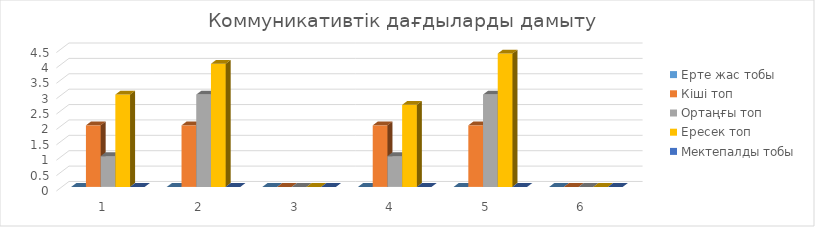
| Category | Ерте жас тобы  | Кіші топ | Ортаңғы топ | Ересек топ | Мектепалды тобы |
|---|---|---|---|---|---|
| 0 | 0 | 2 | 1 | 3 | 0 |
| 1 | 0 | 2 | 3 | 4 | 0 |
| 2 | 0 | 0 | 0 | 0 | 0 |
| 3 | 0 | 2 | 1 | 2.667 | 0 |
| 4 | 0 | 2 | 3 | 4.333 | 0 |
| 5 | 0 | 0 | 0 | 0 | 0 |